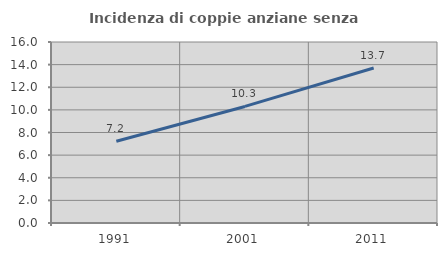
| Category | Incidenza di coppie anziane senza figli  |
|---|---|
| 1991.0 | 7.226 |
| 2001.0 | 10.304 |
| 2011.0 | 13.699 |